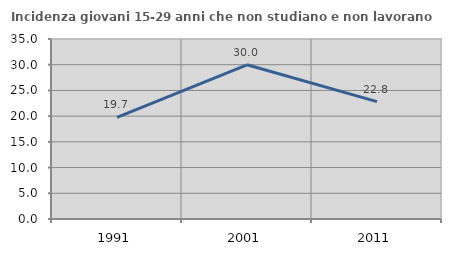
| Category | Incidenza giovani 15-29 anni che non studiano e non lavorano  |
|---|---|
| 1991.0 | 19.747 |
| 2001.0 | 29.984 |
| 2011.0 | 22.825 |